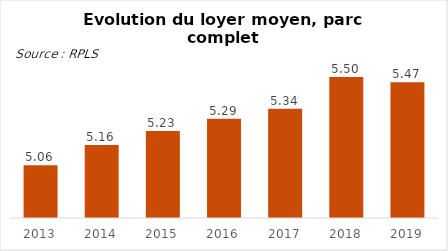
| Category | Series 0 |
|---|---|
| 2013.0 | 5.06 |
| 2014.0 | 5.16 |
| 2015.0 | 5.23 |
| 2016.0 | 5.29 |
| 2017.0 | 5.34 |
| 2018.0 | 5.496 |
| 2019.0 | 5.47 |